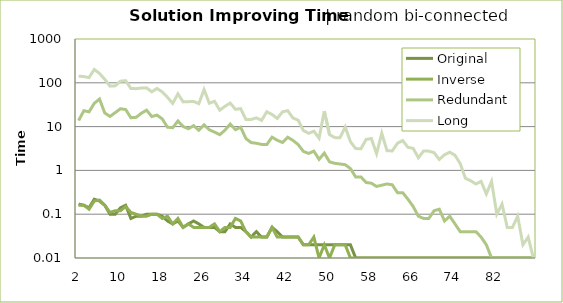
| Category | Original | Inverse | Redundant | Long |
|---|---|---|---|---|
| 2.0 | 0.17 | 0.16 | 13.72 | 142.12 |
| 3.0 | 0.16 | 0.16 | 23.04 | 138.26 |
| 4.0 | 0.14 | 0.13 | 21.77 | 132.02 |
| 5.0 | 0.22 | 0.2 | 34.02 | 201.8 |
| 6.0 | 0.2 | 0.21 | 42.59 | 163.57 |
| 7.0 | 0.16 | 0.16 | 20.46 | 120.01 |
| 8.0 | 0.1 | 0.11 | 17.06 | 83.91 |
| 9.0 | 0.1 | 0.12 | 20.84 | 85.17 |
| 10.0 | 0.14 | 0.12 | 25.55 | 109.17 |
| 11.0 | 0.16 | 0.15 | 24.55 | 111.93 |
| 12.0 | 0.08 | 0.11 | 15.96 | 73.88 |
| 13.0 | 0.09 | 0.1 | 16.26 | 73.55 |
| 14.0 | 0.09 | 0.09 | 20.23 | 76.03 |
| 15.0 | 0.1 | 0.09 | 23.7 | 76.7 |
| 16.0 | 0.1 | 0.1 | 16.98 | 62.18 |
| 17.0 | 0.1 | 0.1 | 18.3 | 74.36 |
| 18.0 | 0.09 | 0.08 | 15 | 61.77 |
| 19.0 | 0.07 | 0.09 | 9.68 | 46.54 |
| 20.0 | 0.06 | 0.06 | 9.44 | 33.88 |
| 21.0 | 0.07 | 0.08 | 13.42 | 55.88 |
| 22.0 | 0.05 | 0.05 | 10.03 | 36.67 |
| 23.0 | 0.06 | 0.06 | 8.94 | 37.08 |
| 24.0 | 0.07 | 0.05 | 10.5 | 37.54 |
| 25.0 | 0.06 | 0.05 | 8.25 | 33.48 |
| 26.0 | 0.05 | 0.05 | 10.97 | 69.93 |
| 27.0 | 0.05 | 0.05 | 8.45 | 34.16 |
| 28.0 | 0.05 | 0.06 | 7.48 | 37.82 |
| 29.0 | 0.04 | 0.04 | 6.53 | 23.72 |
| 30.0 | 0.04 | 0.05 | 8.28 | 29.06 |
| 31.0 | 0.06 | 0.05 | 11.43 | 34.44 |
| 32.0 | 0.05 | 0.08 | 8.52 | 24.82 |
| 33.0 | 0.05 | 0.07 | 9.67 | 25.73 |
| 34.0 | 0.04 | 0.04 | 5.35 | 14.55 |
| 35.0 | 0.03 | 0.03 | 4.31 | 14.52 |
| 36.0 | 0.04 | 0.03 | 4.17 | 15.86 |
| 37.0 | 0.03 | 0.03 | 3.92 | 13.88 |
| 38.0 | 0.03 | 0.03 | 3.89 | 21.81 |
| 39.0 | 0.05 | 0.05 | 5.74 | 18.86 |
| 40.0 | 0.04 | 0.03 | 4.88 | 15.37 |
| 41.0 | 0.03 | 0.03 | 4.34 | 21.7 |
| 42.0 | 0.03 | 0.03 | 5.72 | 23.13 |
| 43.0 | 0.03 | 0.03 | 4.85 | 15.72 |
| 44.0 | 0.03 | 0.03 | 3.89 | 14.03 |
| 45.0 | 0.02 | 0.02 | 2.71 | 8.12 |
| 46.0 | 0.02 | 0.02 | 2.44 | 7.02 |
| 47.0 | 0.02 | 0.03 | 2.75 | 7.86 |
| 48.0 | 0.02 | 0.01 | 1.79 | 5.44 |
| 49.0 | 0.02 | 0.02 | 2.48 | 22.58 |
| 50.0 | 0.02 | 0.01 | 1.57 | 6.56 |
| 51.0 | 0.02 | 0.02 | 1.45 | 5.61 |
| 52.0 | 0.02 | 0.02 | 1.4 | 5.55 |
| 53.0 | 0.02 | 0.02 | 1.35 | 9.8 |
| 54.0 | 0.02 | 0.01 | 1.1 | 4.53 |
| 55.0 | 0.01 | 0.01 | 0.71 | 3.15 |
| 56.0 | 0.01 | 0.01 | 0.71 | 3.12 |
| 57.0 | 0.01 | 0.01 | 0.53 | 5.08 |
| 58.0 | 0.01 | 0.01 | 0.51 | 5.35 |
| 59.0 | 0.01 | 0.01 | 0.43 | 2.41 |
| 60.0 | 0.01 | 0.01 | 0.46 | 7.05 |
| 61.0 | 0.01 | 0.01 | 0.49 | 2.82 |
| 62.0 | 0.01 | 0.01 | 0.47 | 2.78 |
| 63.0 | 0.01 | 0.01 | 0.31 | 4.17 |
| 64.0 | 0.01 | 0.01 | 0.31 | 4.79 |
| 65.0 | 0.01 | 0.01 | 0.22 | 3.36 |
| 66.0 | 0.01 | 0.01 | 0.15 | 3.19 |
| 67.0 | 0.01 | 0.01 | 0.09 | 1.94 |
| 68.0 | 0.01 | 0.01 | 0.08 | 2.78 |
| 69.0 | 0.01 | 0.01 | 0.08 | 2.75 |
| 70.0 | 0.01 | 0.01 | 0.12 | 2.54 |
| 71.0 | 0.01 | 0.01 | 0.13 | 1.78 |
| 72.0 | 0.01 | 0.01 | 0.07 | 2.28 |
| 73.0 | 0.01 | 0.01 | 0.09 | 2.6 |
| 74.0 | 0.01 | 0.01 | 0.06 | 2.22 |
| 75.0 | 0.01 | 0.01 | 0.04 | 1.43 |
| 76.0 | 0.01 | 0.01 | 0.04 | 0.66 |
| 77.0 | 0.01 | 0.01 | 0.04 | 0.58 |
| 78.0 | 0.01 | 0.01 | 0.04 | 0.49 |
| 79.0 | 0.01 | 0.01 | 0.03 | 0.56 |
| 80.0 | 0.01 | 0.01 | 0.02 | 0.29 |
| 81.0 | 0.01 | 0.01 | 0.01 | 0.56 |
| 82.0 | 0.01 | 0.01 | 0.01 | 0.1 |
| 83.0 | 0.01 | 0.01 | 0.01 | 0.17 |
| 84.0 | 0.01 | 0.01 | 0.01 | 0.05 |
| 85.0 | 0.01 | 0.01 | 0.01 | 0.05 |
| 86.0 | 0.01 | 0.01 | 0.01 | 0.09 |
| 87.0 | 0.01 | 0.01 | 0.01 | 0.02 |
| 88.0 | 0.01 | 0.01 | 0.01 | 0.03 |
| 89.0 | 0.01 | 0.01 | 0.01 | 0.01 |